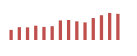
| Category | Importações (2) |
|---|---|
| 0 | 63256.661 |
| 1 | 80362.628 |
| 2 | 79098.748 |
| 3 | 89493.365 |
| 4 | 81914.569 |
| 5 | 86371.3 |
| 6 | 122399.001 |
| 7 | 125153.991 |
| 8 | 116754.909 |
| 9 | 110190.536 |
| 10 | 137205.926 |
| 11 | 154727.051 |
| 12 | 169208.338 |
| 13 | 163649.316 |